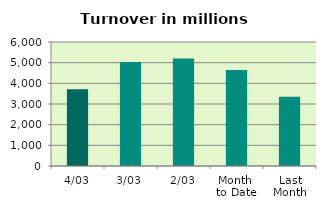
| Category | Series 0 |
|---|---|
| 4/03 | 3717.616 |
| 3/03 | 5028.192 |
| 2/03 | 5202.605 |
| Month 
to Date | 4649.471 |
| Last
Month | 3347.876 |